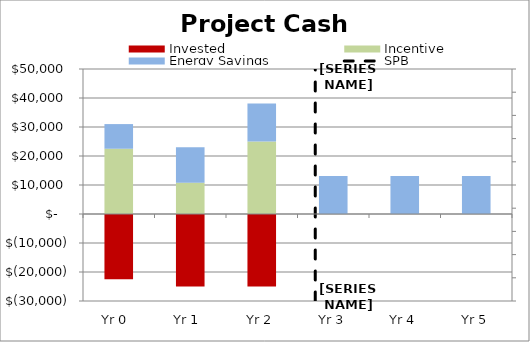
| Category | Invested | Incentive | Energy Savings |
|---|---|---|---|
| Yr 0  | -22500 | 22500 | 8505.635 |
| Yr 1  | -25000 | 10800.8 | 12207.619 |
| Yr 2 | -25000 | 25000 | 13082.341 |
| Yr 3 | 0 | 0 | 13082.341 |
| Yr 4 | 0 | 0 | 13082.341 |
| Yr 5 | 0 | 0 | 13082.341 |